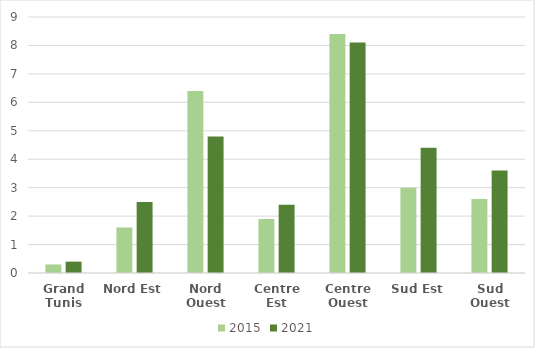
| Category | 2015 | 2021 |
|---|---|---|
| Grand Tunis | 0.3 | 0.4 |
| Nord Est | 1.6 | 2.5 |
| Nord Ouest | 6.4 | 4.8 |
| Centre Est | 1.9 | 2.4 |
| Centre Ouest | 8.4 | 8.1 |
| Sud Est | 3 | 4.4 |
| Sud Ouest | 2.6 | 3.6 |